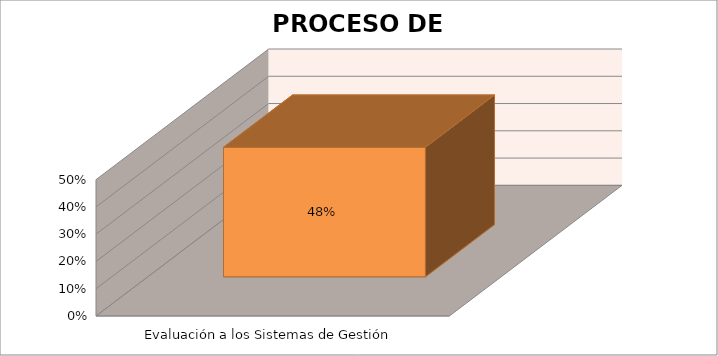
| Category | Series 0 |
|---|---|
| Evaluación a los Sistemas de Gestión  | 0.475 |